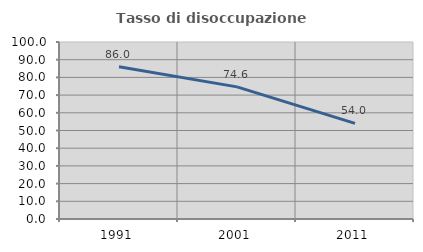
| Category | Tasso di disoccupazione giovanile  |
|---|---|
| 1991.0 | 85.971 |
| 2001.0 | 74.648 |
| 2011.0 | 54.018 |